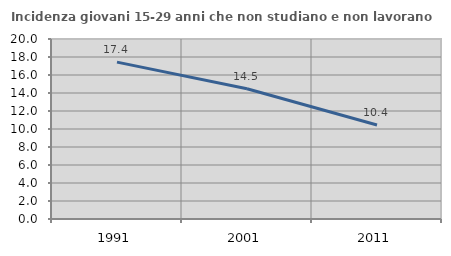
| Category | Incidenza giovani 15-29 anni che non studiano e non lavorano  |
|---|---|
| 1991.0 | 17.431 |
| 2001.0 | 14.474 |
| 2011.0 | 10.448 |